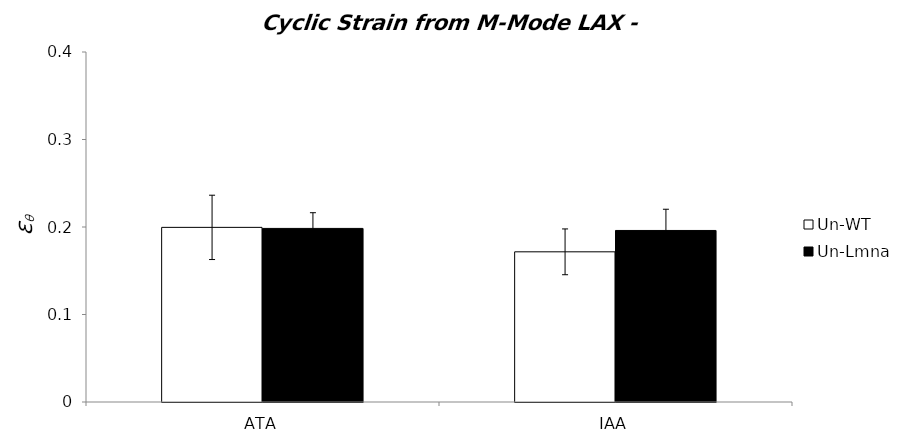
| Category | Un-WT | Un-Lmna |
|---|---|---|
| 0 | 0.2 | 0.198 |
| 1 | 0.172 | 0.196 |